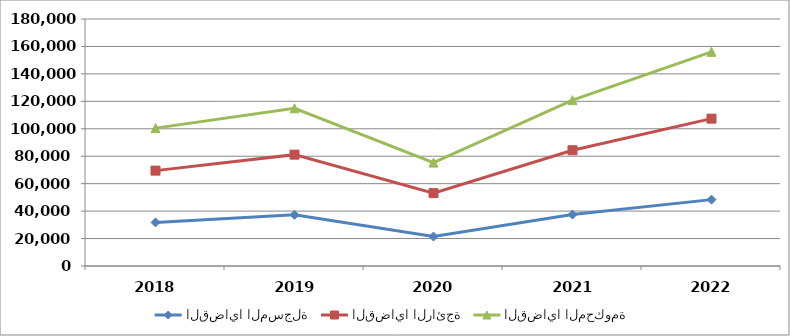
| Category | القضايا المسجلة | القضايا الرائجة | القضايا المحكومة |
|---|---|---|---|
| 2018.0 | 31741 | 37759 | 30975 |
| 2019.0 | 37260 | 43895 | 33755 |
| 2020.0 | 21485 | 31625 | 22248 |
| 2021.0 | 37512 | 46844 | 36530 |
| 2022.0 | 48371 | 59006 | 48678 |